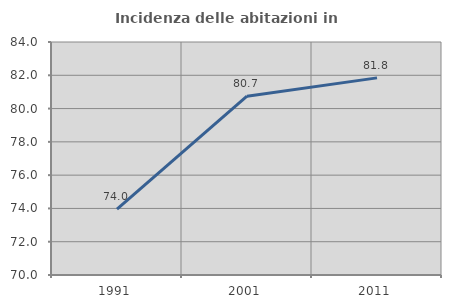
| Category | Incidenza delle abitazioni in proprietà  |
|---|---|
| 1991.0 | 73.961 |
| 2001.0 | 80.745 |
| 2011.0 | 81.845 |